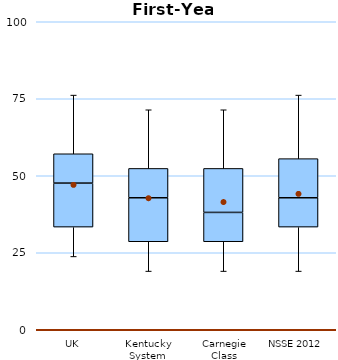
| Category | 25th | 50th | 75th |
|---|---|---|---|
| UK | 33.333 | 14.286 | 9.524 |
| Kentucky System | 28.571 | 14.286 | 9.524 |
| Carnegie Class | 28.571 | 9.524 | 14.286 |
| NSSE 2012 | 33.333 | 9.524 | 12.698 |